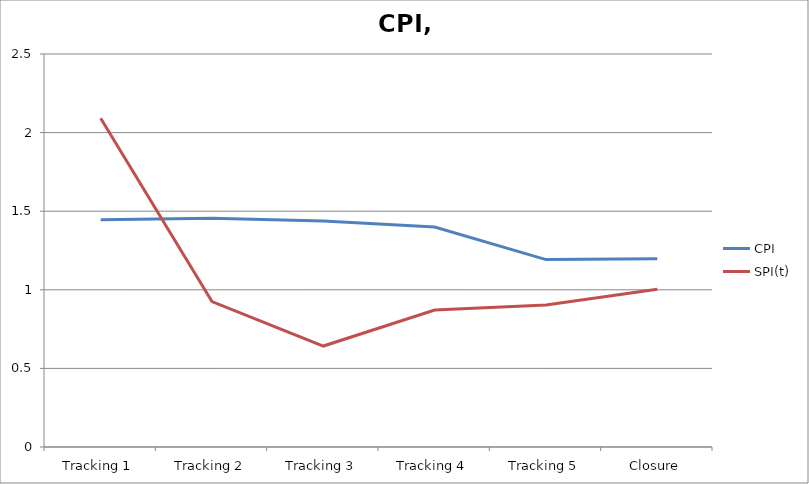
| Category | CPI | SPI(t) |
|---|---|---|
| Tracking 1 | 1.445 | 2.091 |
| Tracking 2 | 1.455 | 0.925 |
| Tracking 3 | 1.438 | 0.642 |
| Tracking 4 | 1.4 | 0.871 |
| Tracking 5 | 1.192 | 0.903 |
| Closure | 1.197 | 1.004 |